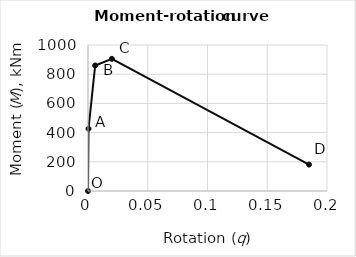
| Category | Series 0 |
|---|---|
| 0.0 | 0 |
| 0.00043 | 426.603 |
| 0.006 | 859.817 |
| 0.02 | 905.071 |
| 0.185 | 181.014 |